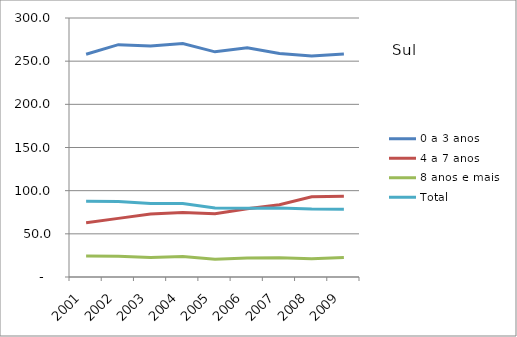
| Category | 0 a 3 anos | 4 a 7 anos | 8 anos e mais | Total |
|---|---|---|---|---|
| 2001.0 | 258 | 62.8 | 24.4 | 87.6 |
| 2002.0 | 269.1 | 67.9 | 24.1 | 87.5 |
| 2003.0 | 267.6 | 73.1 | 22.5 | 85 |
| 2004.0 | 270.4 | 74.6 | 23.7 | 85.2 |
| 2005.0 | 260.8 | 73.2 | 20.6 | 79.8 |
| 2006.0 | 265.4 | 79 | 22.1 | 79.7 |
| 2007.0 | 258.9 | 83.6 | 22.4 | 80 |
| 2008.0 | 256.1 | 92.9 | 21.2 | 78.7 |
| 2009.0 | 258.4 | 93.6 | 22.7 | 78.6 |